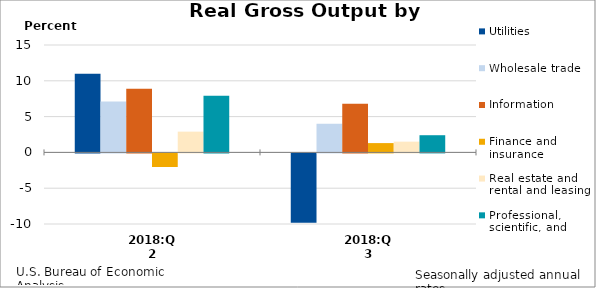
| Category | Utilities | Wholesale trade | Information | Finance and insurance | Real estate and rental and leasing | Professional, scientific, and technical services |
|---|---|---|---|---|---|---|
| 2018:Q2 | 11 | 7.1 | 8.9 | -1.9 | 2.9 | 7.9 |
| 2018:Q3 | -9.7 | 4 | 6.8 | 1.3 | 1.5 | 2.4 |